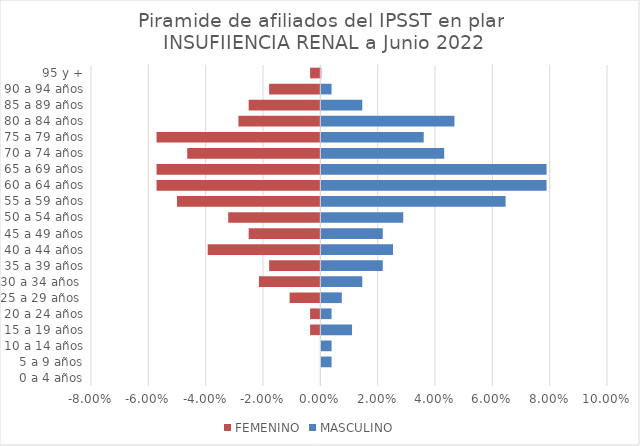
| Category | FEMENINO | MASCULINO |
|---|---|---|
| 0 a 4 años | 0 | 0 |
| 5 a 9 años | 0 | 0.004 |
| 10 a 14 años | 0 | 0.004 |
| 15 a 19 años | -0.004 | 0.011 |
| 20 a 24 años | -0.004 | 0.004 |
| 25 a 29 años  | -0.011 | 0.007 |
| 30 a 34 años  | -0.021 | 0.014 |
| 35 a 39 años | -0.018 | 0.021 |
| 40 a 44 años | -0.039 | 0.025 |
| 45 a 49 años | -0.025 | 0.021 |
| 50 a 54 años | -0.032 | 0.029 |
| 55 a 59 años | -0.05 | 0.064 |
| 60 a 64 años | -0.057 | 0.079 |
| 65 a 69 años | -0.057 | 0.079 |
| 70 a 74 años | -0.046 | 0.043 |
| 75 a 79 años | -0.057 | 0.036 |
| 80 a 84 años | -0.029 | 0.046 |
| 85 a 89 años | -0.025 | 0.014 |
| 90 a 94 años | -0.018 | 0.004 |
| 95 y + | -0.004 | 0 |